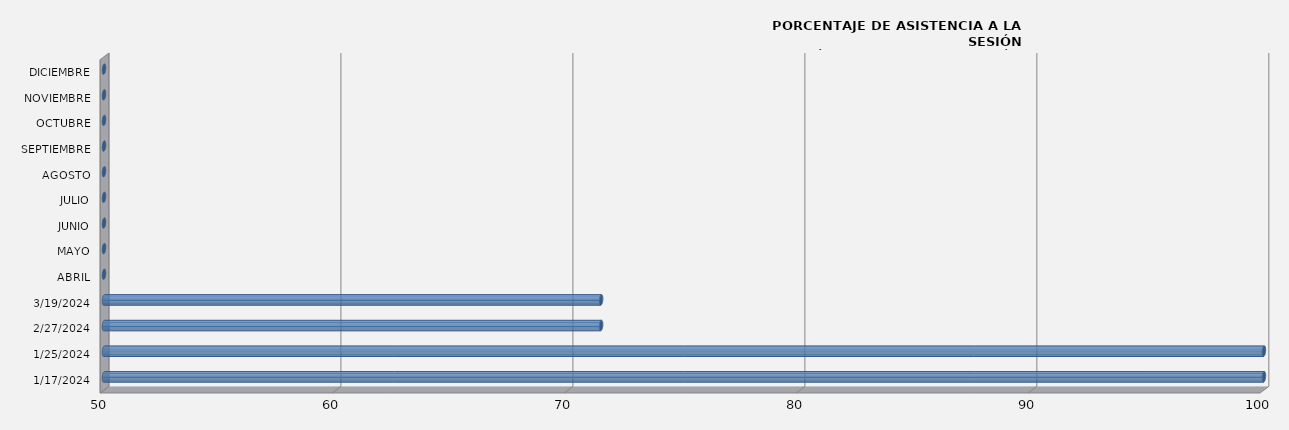
| Category | Series 0 |
|---|---|
| 17/01/2024 | 100 |
| 25/01/2024 | 100 |
| 27/02/2024 | 71.429 |
| 19/03/2024 | 71.429 |
| ABRIL | 0 |
| MAYO | 0 |
| JUNIO | 0 |
| JULIO | 0 |
| AGOSTO | 0 |
| SEPTIEMBRE | 0 |
| OCTUBRE | 0 |
| NOVIEMBRE | 0 |
| DICIEMBRE | 0 |